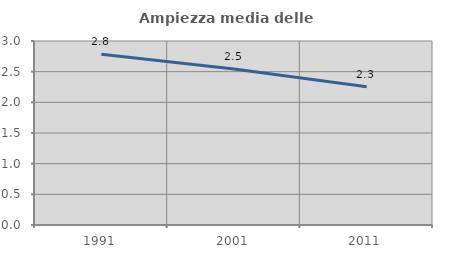
| Category | Ampiezza media delle famiglie |
|---|---|
| 1991.0 | 2.783 |
| 2001.0 | 2.545 |
| 2011.0 | 2.253 |